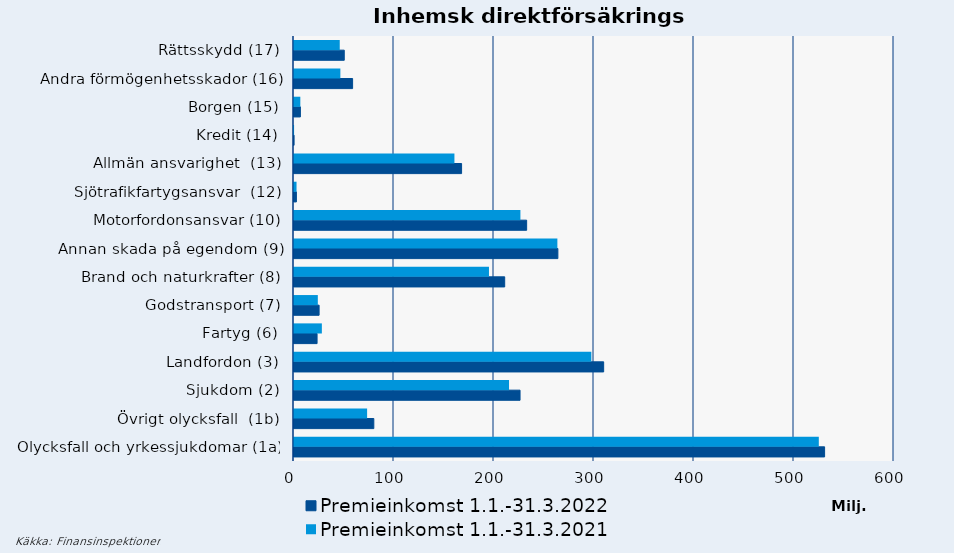
| Category | Premieinkomst |
|---|---|
| Olycksfall och yrkessjukdomar (1a) | 524808.173 |
| Övrigt olycksfall  (1b) | 73111.188 |
| Sjukdom (2) | 215034.143 |
| Landfordon (3) | 297332.108 |
| Fartyg (6) | 27853.436 |
| Godstransport (7) | 23821.282 |
| Brand och naturkrafter (8) | 194974.919 |
| Annan skada på egendom (9) | 263378.092 |
| Motorfordonsansvar (10) | 226410.398 |
| Sjötrafikfartygsansvar  (12) | 2539.575 |
| Allmän ansvarighet  (13) | 160427.687 |
| Kredit (14) | 78.734 |
| Borgen (15) | 6327.361 |
| Andra förmögenhetsskador (16) | 46359.449 |
| Rättsskydd (17) | 45748.894 |